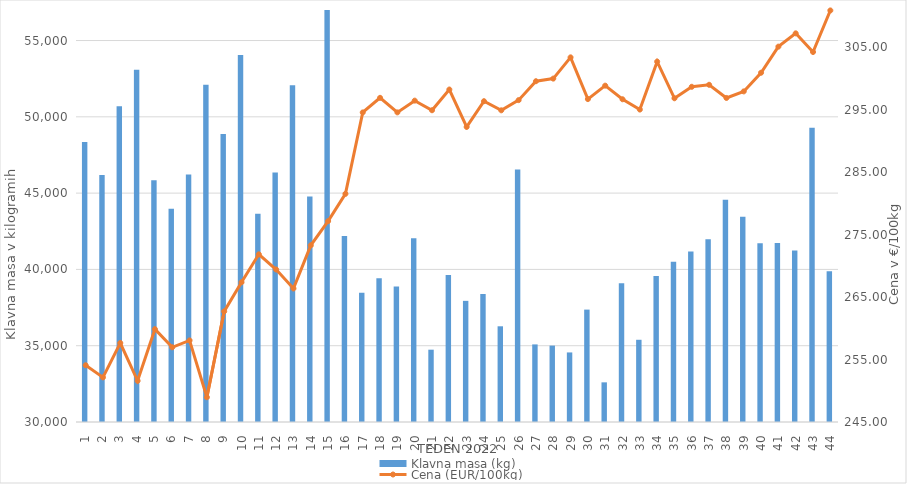
| Category | Klavna masa (kg) |
|---|---|
| 1.0 | 48349 |
| 2.0 | 46187 |
| 3.0 | 50692 |
| 4.0 | 53081 |
| 5.0 | 45844 |
| 6.0 | 43982 |
| 7.0 | 46227 |
| 8.0 | 52099 |
| 9.0 | 48872 |
| 10.0 | 54045 |
| 11.0 | 43645 |
| 12.0 | 46350 |
| 13.0 | 52061 |
| 14.0 | 44774 |
| 15.0 | 57268 |
| 16.0 | 42191 |
| 17.0 | 38469 |
| 18.0 | 39417 |
| 19.0 | 38876 |
| 20.0 | 42047 |
| 21.0 | 34739 |
| 22.0 | 39626 |
| 23.0 | 37939 |
| 24.0 | 38390 |
| 25.0 | 36272 |
| 26.0 | 46553 |
| 27.0 | 35085 |
| 28.0 | 35007 |
| 29.0 | 34559 |
| 30.0 | 37366 |
| 31.0 | 32599 |
| 32.0 | 39100 |
| 33.0 | 35388 |
| 34.0 | 39563 |
| 35.0 | 40507 |
| 36.0 | 41176 |
| 37.0 | 41983 |
| 38.0 | 44572 |
| 39.0 | 43447 |
| 40.0 | 41711 |
| 41.0 | 41736 |
| 42.0 | 41239 |
| 43.0 | 49284 |
| 44.0 | 39877 |